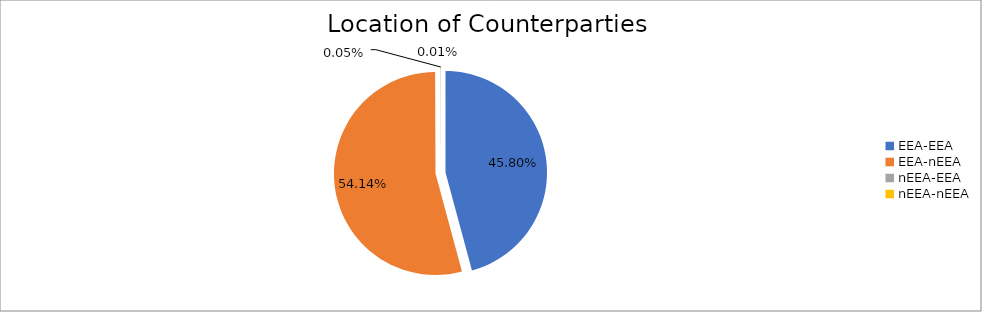
| Category | Series 0 |
|---|---|
| EEA-EEA | 5835791.018 |
| EEA-nEEA | 6897973.064 |
| nEEA-EEA | 6456.656 |
| nEEA-nEEA | 991.81 |